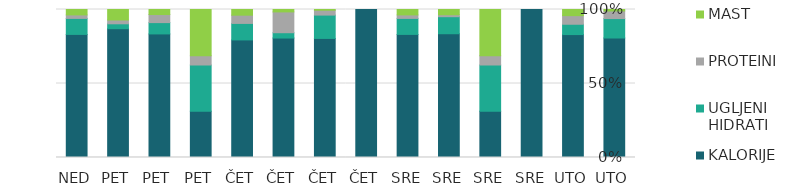
| Category | KALORIJE | UGLJENI HIDRATI | PROTEINI | MAST |
|---|---|---|---|---|
| UTO | 283 | 46 | 18 | 3.5 |
| UTO | 500 | 42 | 35 | 25 |
| SRE | 1 | 0 | 0 | 0 |
| SRE | 10 | 10 | 2 | 10 |
| SRE | 189 | 26 | 3 | 8 |
| SRE | 477 | 62 | 13.5 | 21 |
| ČET | 1 | 0 | 0 | 0 |
| ČET | 245 | 48 | 10 | 1.5 |
| ČET | 247 | 11 | 43 | 5 |
| ČET | 456 | 64 | 32 | 22 |
| PET | 10 | 10 | 2 | 10 |
| PET | 135 | 12.36 | 8.81 | 5.51 |
| PET | 184 | 7 | 5.43 | 15 |
| NED | 477 | 62 | 13.5 | 21 |